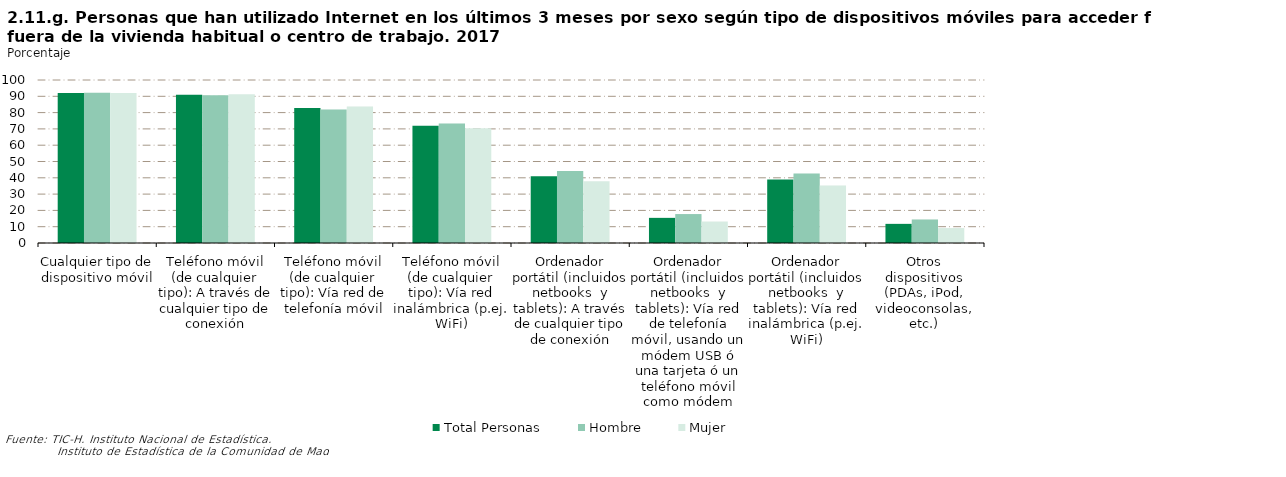
| Category | Total Personas | Hombre | Mujer |
|---|---|---|---|
| Cualquier tipo de dispositivo móvil | 92.043 | 92.106 | 91.982 |
| Teléfono móvil (de cualquier tipo): A través de cualquier tipo de conexión | 90.978 | 90.716 | 91.232 |
| Teléfono móvil (de cualquier tipo): Vía red de telefonía móvil | 82.854 | 81.866 | 83.808 |
| Teléfono móvil (de cualquier tipo): Vía red inalámbrica (p.ej. WiFi) | 71.879 | 73.378 | 70.432 |
| Ordenador portátil (incluidos netbooks  y tablets): A través de cualquier tipo de conexión | 40.987 | 44.187 | 37.898 |
| Ordenador portátil (incluidos netbooks  y tablets): Vía red de telefonía móvil, usando un módem USB ó una tarjeta ó un teléfono móvil como módem | 15.424 | 17.751 | 13.177 |
| Ordenador portátil (incluidos netbooks  y tablets): Vía red inalámbrica (p.ej. WiFi) | 38.935 | 42.697 | 35.303 |
| Otros dispositivos (PDAs, iPod, videoconsolas, etc.) | 11.742 | 14.431 | 9.146 |